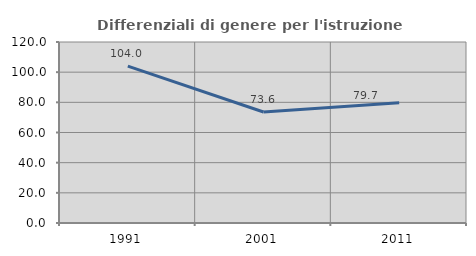
| Category | Differenziali di genere per l'istruzione superiore |
|---|---|
| 1991.0 | 104.049 |
| 2001.0 | 73.582 |
| 2011.0 | 79.705 |